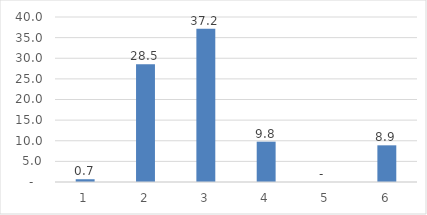
| Category | Frw Billion |
|---|---|
| 0 | 0.671 |
| 1 | 28.546 |
| 2 | 37.159 |
| 3 | 9.775 |
| 4 | 0 |
| 5 | 8.89 |